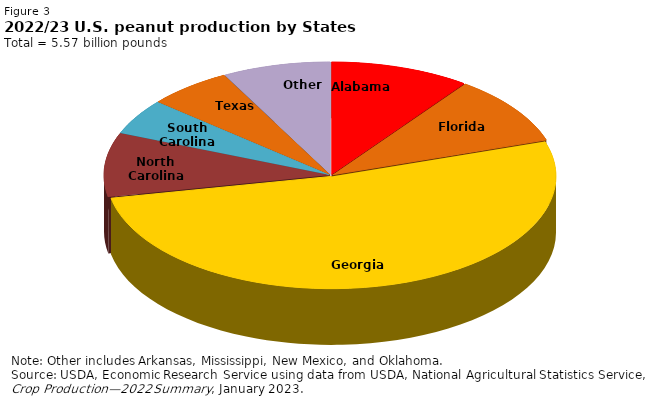
| Category | Series 0 |
|---|---|
| Alabama | 0.1 |
| Florida | 0.099 |
| Georgia | 0.519 |
| North Carolina | 0.092 |
| South Carolina | 0.051 |
| Texas | 0.06 |
| Other | 0.078 |